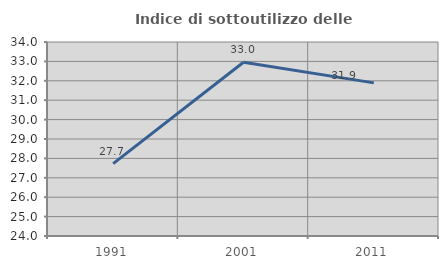
| Category | Indice di sottoutilizzo delle abitazioni  |
|---|---|
| 1991.0 | 27.731 |
| 2001.0 | 32.956 |
| 2011.0 | 31.892 |